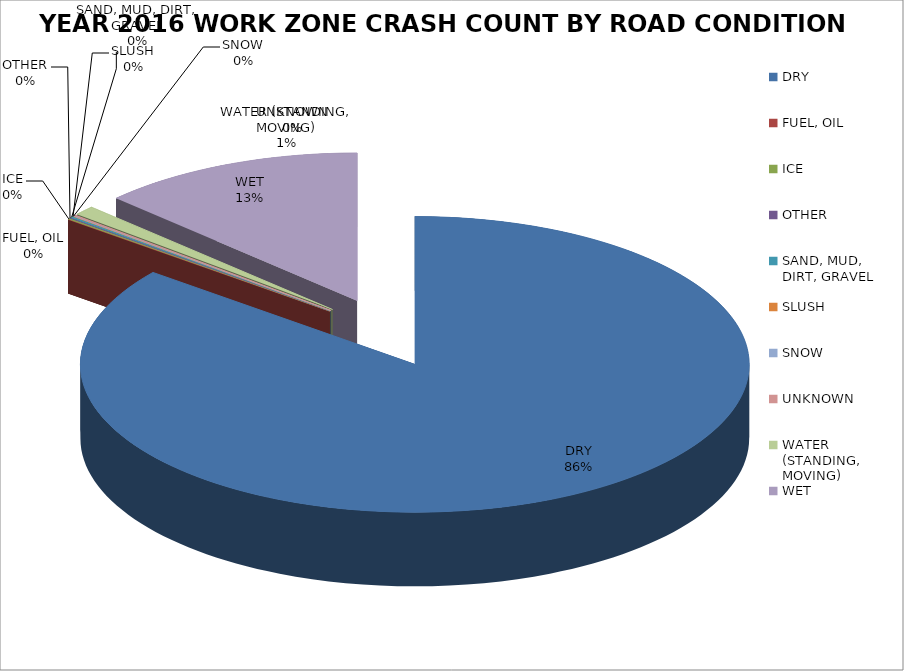
| Category | YEAR 2021 WORK ZONE CRASH COUNT* |
|---|---|
| DRY | 0.857 |
| FUEL, OIL | 0 |
| ICE | 0.001 |
| OTHER | 0.001 |
| SAND, MUD, DIRT, GRAVEL | 0.001 |
| SLUSH | 0 |
| SNOW | 0 |
| UNKNOWN | 0.001 |
| WATER (STANDING, MOVING) | 0.01 |
| WET | 0.128 |